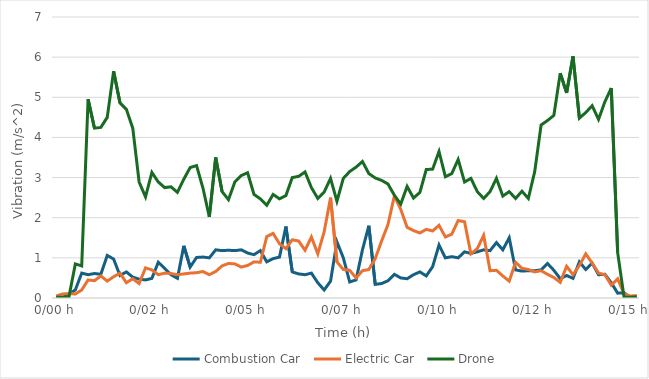
| Category | Combustion Car  | Electric Car  | Drone |
|---|---|---|---|
| 0.0 | 0.01 | 0.05 | 0.02 |
| 0.00011574074074074075 | 0.01 | 0.1 | 0.02 |
| 0.000231481481481481 | 0.1 | 0.11 | 0.03 |
| 0.000347222222222222 | 0.2 | 0.1 | 0.85 |
| 0.000462962962962963 | 0.62 | 0.2 | 0.8 |
| 0.000578703703703704 | 0.58 | 0.45 | 4.95 |
| 0.000694444444444444 | 0.61 | 0.43 | 4.23 |
| 0.000810185185185185 | 0.59 | 0.55 | 4.25 |
| 0.000925925925925926 | 1.06 | 0.42 | 4.5 |
| 0.00104166666666667 | 0.97 | 0.53 | 5.65 |
| 0.00115740740740741 | 0.56 | 0.62 | 4.86 |
| 0.00127314814814815 | 0.65 | 0.38 | 4.7 |
| 0.00138888888888889 | 0.52 | 0.48 | 4.23 |
| 0.00150462962962963 | 0.47 | 0.36 | 2.89 |
| 0.00162037037037037 | 0.45 | 0.75 | 2.52 |
| 0.00173611111111111 | 0.49 | 0.7 | 3.13 |
| 0.00185185185185185 | 0.89 | 0.58 | 2.89 |
| 0.00196759259259259 | 0.74 | 0.62 | 2.75 |
| 0.00208333333333333 | 0.58 | 0.61 | 2.77 |
| 0.00219907407407407 | 0.49 | 0.58 | 2.63 |
| 0.00231481481481481 | 1.3 | 0.6 | 2.96 |
| 0.00243055555555556 | 0.77 | 0.62 | 3.25 |
| 0.0025462962962963 | 1.01 | 0.63 | 3.3 |
| 0.00266203703703704 | 1.02 | 0.66 | 2.74 |
| 0.00277777777777778 | 1 | 0.58 | 2.02 |
| 0.00289351851851852 | 1.2 | 0.66 | 3.5 |
| 0.00300925925925926 | 1.18 | 0.8 | 2.65 |
| 0.003125 | 1.19 | 0.86 | 2.45 |
| 0.00324074074074074 | 1.18 | 0.85 | 2.89 |
| 0.00335648148148148 | 1.2 | 0.77 | 3.05 |
| 0.00347222222222222 | 1.12 | 0.81 | 3.12 |
| 0.00358796296296296 | 1.08 | 0.9 | 2.58 |
| 0.0037037037037037 | 1.18 | 0.89 | 2.47 |
| 0.00381944444444444 | 0.9 | 1.53 | 2.31 |
| 0.00393518518518519 | 0.98 | 1.61 | 2.58 |
| 0.00405092592592593 | 1.02 | 1.35 | 2.47 |
| 0.00416666666666667 | 1.78 | 1.23 | 2.55 |
| 0.00428240740740741 | 0.65 | 1.45 | 3 |
| 0.00439814814814815 | 0.6 | 1.42 | 3.03 |
| 0.00451388888888889 | 0.58 | 1.19 | 3.14 |
| 0.00462962962962963 | 0.62 | 1.52 | 2.75 |
| 0.00474537037037037 | 0.38 | 1.1 | 2.48 |
| 0.00486111111111111 | 0.2 | 1.65 | 2.64 |
| 0.00497685185185185 | 0.42 | 2.5 | 2.98 |
| 0.00509259259259259 | 1.4 | 0.9 | 2.41 |
| 0.00520833333333333 | 1 | 0.71 | 2.98 |
| 0.00532407407407407 | 0.4 | 0.69 | 3.15 |
| 0.00543981481481481 | 0.45 | 0.5 | 3.26 |
| 0.00555555555555556 | 1.2 | 0.68 | 3.4 |
| 0.0056712962962963 | 1.8 | 0.71 | 3.1 |
| 0.00578703703703704 | 0.34 | 0.98 | 2.99 |
| 0.00590277777777778 | 0.36 | 1.42 | 2.93 |
| 0.00601851851851852 | 0.43 | 1.83 | 2.84 |
| 0.00613425925925926 | 0.59 | 2.54 | 2.56 |
| 0.00625 | 0.5 | 2.21 | 2.34 |
| 0.00636574074074074 | 0.48 | 1.76 | 2.78 |
| 0.00648148148148148 | 0.58 | 1.68 | 2.49 |
| 0.00659722222222222 | 0.65 | 1.62 | 2.63 |
| 0.00671296296296296 | 0.55 | 1.71 | 3.2 |
| 0.0068287037037037 | 0.78 | 1.67 | 3.21 |
| 0.00694444444444444 | 1.32 | 1.81 | 3.65 |
| 0.00706018518518519 | 1 | 1.52 | 3.02 |
| 0.00717592592592593 | 1.03 | 1.59 | 3.1 |
| 0.00729166666666667 | 1 | 1.93 | 3.45 |
| 0.00740740740740741 | 1.15 | 1.9 | 2.89 |
| 0.00752314814814815 | 1.11 | 1.1 | 2.98 |
| 0.00763888888888889 | 1.15 | 1.23 | 2.65 |
| 0.00775462962962963 | 1.2 | 1.56 | 2.48 |
| 0.00787037037037037 | 1.18 | 0.68 | 2.65 |
| 0.00798611111111111 | 1.38 | 0.69 | 2.98 |
| 0.00810185185185185 | 1.2 | 0.55 | 2.54 |
| 0.00821759259259259 | 1.5 | 0.42 | 2.65 |
| 0.00833333333333333 | 0.7 | 0.89 | 2.48 |
| 0.00844907407407407 | 0.67 | 0.74 | 2.66 |
| 0.00856481481481482 | 0.68 | 0.71 | 2.48 |
| 0.00868055555555556 | 0.68 | 0.65 | 3.15 |
| 0.0087962962962963 | 0.7 | 0.68 | 4.31 |
| 0.00891203703703704 | 0.86 | 0.59 | 4.42 |
| 0.00902777777777778 | 0.69 | 0.51 | 4.55 |
| 0.00914351851851852 | 0.48 | 0.39 | 5.6 |
| 0.00925925925925926 | 0.56 | 0.79 | 5.11 |
| 0.009375 | 0.49 | 0.58 | 6.02 |
| 0.00949074074074074 | 0.9 | 0.81 | 4.48 |
| 0.00960648148148148 | 0.71 | 1.1 | 4.62 |
| 0.00972222222222222 | 0.87 | 0.87 | 4.79 |
| 0.00983796296296296 | 0.58 | 0.62 | 4.45 |
| 0.0099537037037037 | 0.59 | 0.58 | 4.89 |
| 0.0100694444444444 | 0.38 | 0.32 | 5.23 |
| 0.0101851851851852 | 0.12 | 0.48 | 1.13 |
| 0.0103009259259259 | 0.13 | 0.1 | 0.02 |
| 0.0104166666666667 | 0.01 | 0.05 | 0.02 |
| 0.0105324074074074 | 0.01 | 0.06 | 0.03 |